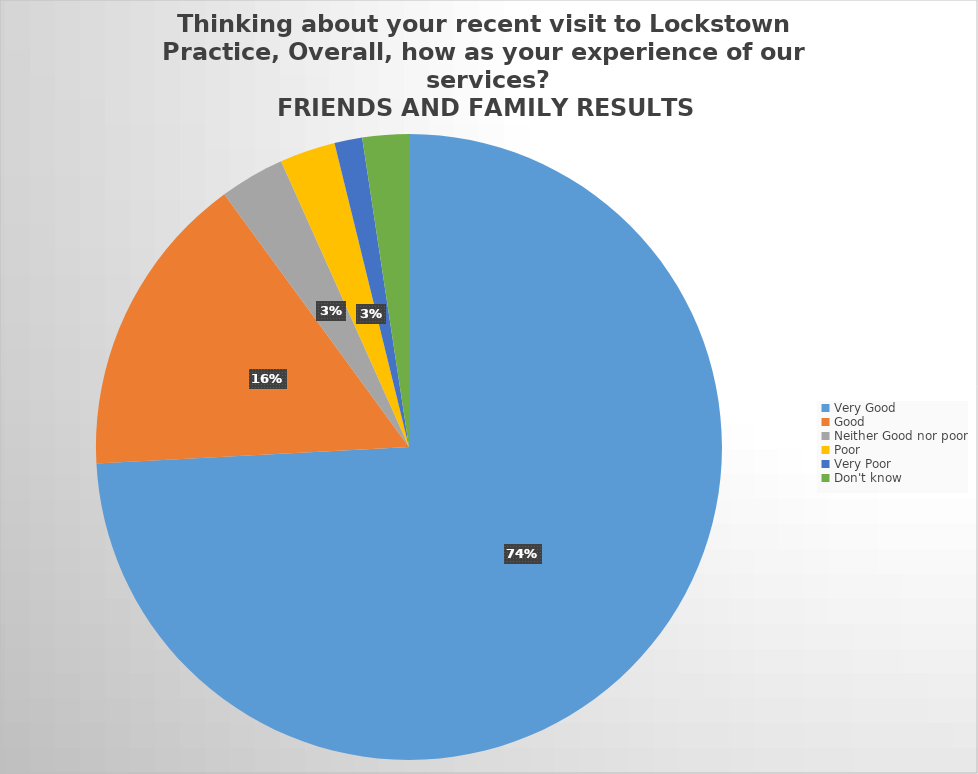
| Category | Responses |
|---|---|
| Very Good | 155 |
| Good | 33 |
| Neither Good nor poor | 7 |
| Poor | 6 |
| Very Poor | 3 |
| Don't know  | 5 |